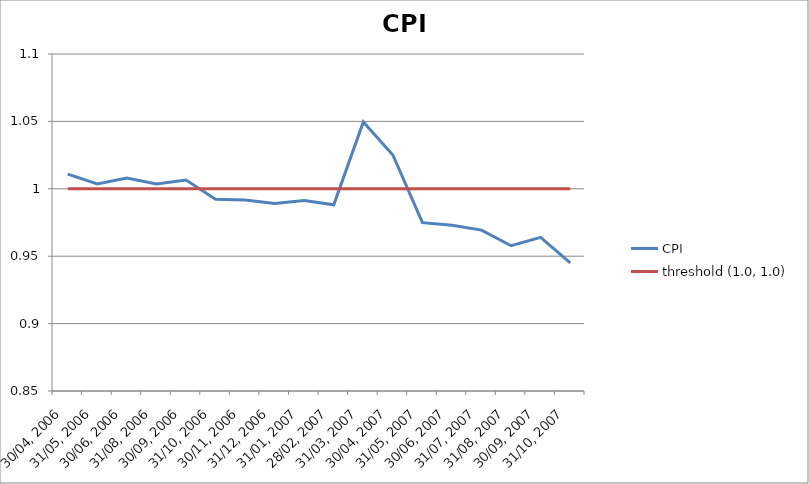
| Category | CPI | threshold (1.0, 1.0) |
|---|---|---|
| 30/04, 2006 | 1.011 | 1 |
| 31/05, 2006 | 1.004 | 1 |
| 30/06, 2006 | 1.008 | 1 |
| 31/08, 2006 | 1.004 | 1 |
| 30/09, 2006 | 1.007 | 1 |
| 31/10, 2006 | 0.992 | 1 |
| 30/11, 2006 | 0.992 | 1 |
| 31/12, 2006 | 0.989 | 1 |
| 31/01, 2007 | 0.991 | 1 |
| 28/02, 2007 | 0.988 | 1 |
| 31/03, 2007 | 1.05 | 1 |
| 30/04, 2007 | 1.025 | 1 |
| 31/05, 2007 | 0.975 | 1 |
| 30/06, 2007 | 0.973 | 1 |
| 31/07, 2007 | 0.969 | 1 |
| 31/08, 2007 | 0.958 | 1 |
| 30/09, 2007 | 0.964 | 1 |
| 31/10, 2007 | 0.945 | 1 |